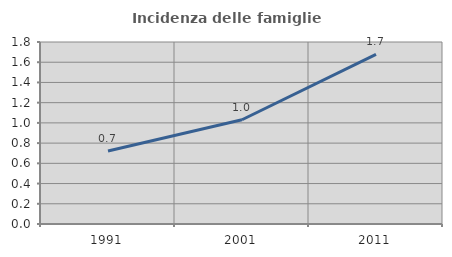
| Category | Incidenza delle famiglie numerose |
|---|---|
| 1991.0 | 0.722 |
| 2001.0 | 1.031 |
| 2011.0 | 1.678 |